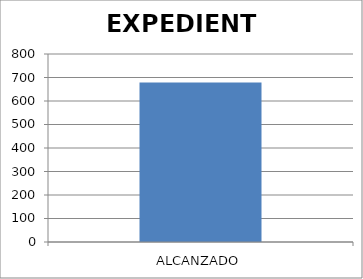
| Category | EXPEDIENTE |
|---|---|
| ALCANZADO | 679 |